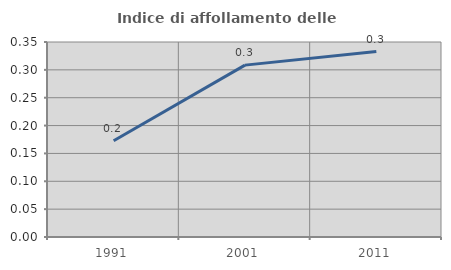
| Category | Indice di affollamento delle abitazioni  |
|---|---|
| 1991.0 | 0.173 |
| 2001.0 | 0.308 |
| 2011.0 | 0.333 |